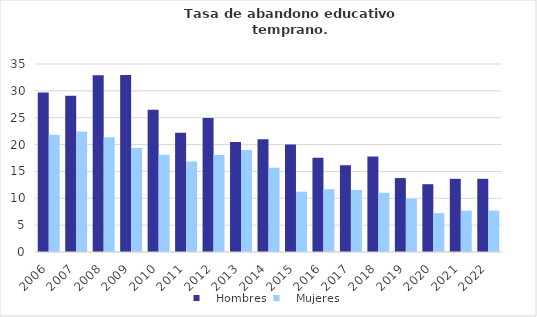
| Category |    Hombres |    Mujeres |
|---|---|---|
| 2006.0 | 29.693 | 21.839 |
| 2007.0 | 29.068 | 22.455 |
| 2008.0 | 32.896 | 21.354 |
| 2009.0 | 32.94 | 19.372 |
| 2010.0 | 26.479 | 18.113 |
| 2011.0 | 22.187 | 16.87 |
| 2012.0 | 24.951 | 18.071 |
| 2013.0 | 20.482 | 18.997 |
| 2014.0 | 20.981 | 15.689 |
| 2015.0 | 20 | 11.226 |
| 2016.0 | 17.544 | 11.683 |
| 2017.0 | 16.132 | 11.543 |
| 2018.0 | 17.802 | 11.033 |
| 2019.0 | 13.764 | 9.921 |
| 2020.0 | 12.624 | 7.238 |
| 2021.0 | 13.625 | 7.709 |
| 2022.0 | 13.625 | 7.709 |